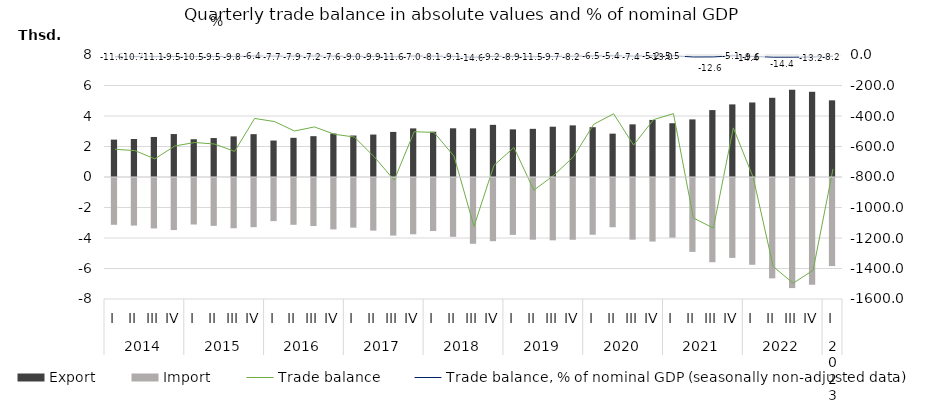
| Category | Export | Import |
|---|---|---|
| 0 | 2450.7 | -3068.8 |
| 1 | 2493.4 | -3120.5 |
| 2 | 2625.5 | -3306.5 |
| 3 | 2816.7 | -3413.2 |
| 4 | 2476.5 | -3050.1 |
| 5 | 2555.2 | -3139.2 |
| 6 | 2663.4 | -3295.5 |
| 7 | 2809.5 | -3225.4 |
| 8 | 2391.5 | -2828.1 |
| 9 | 2569.5 | -3068 |
| 10 | 2678.2 | -3149.9 |
| 11 | 2850.8 | -3370.5 |
| 12 | 2719.6 | -3257.4 |
| 13 | 2783.8 | -3452 |
| 14 | 2956.9 | -3777.4 |
| 15 | 3187 | -3690 |
| 16 | 2969.9 | -3477.4 |
| 17 | 3193.3 | -3857.4 |
| 18 | 3189.7 | -4313.9 |
| 19 | 3420.5 | -4144.2 |
| 20 | 3123.6 | -3730.2 |
| 21 | 3158.2 | -4044.8 |
| 22 | 3298.5 | -4087.5 |
| 23 | 3385.3 | -4051.1 |
| 24 | 3266.4 | -3720.9 |
| 25 | 2842.7 | -3228.3 |
| 26 | 3452.8 | -4043.7 |
| 27 | 3742.7 | -4166.6 |
| 28 | 3526.2 | -3910.7 |
| 29 | 3776 | -4844.9 |
| 30 | 4388.7 | -5523.8 |
| 31 | 4761.5 | -5239.5 |
| 32 | 4886.7 | -5690.3 |
| 33 | 5194.3 | -6581.5 |
| 34 | 5721.7 | -7217.9 |
| 35 | 5588.1 | -6999.8 |
| 36 | 5027.3 | -5773.9 |